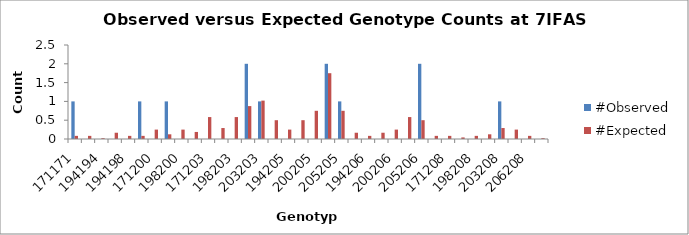
| Category | #Observed | #Expected |
|---|---|---|
| 171171.0 | 1 | 0.083 |
| 171194.0 | 0 | 0.083 |
| 194194.0 | 0 | 0.021 |
| 171198.0 | 0 | 0.167 |
| 194198.0 | 0 | 0.083 |
| 198198.0 | 1 | 0.083 |
| 171200.0 | 0 | 0.25 |
| 194200.0 | 1 | 0.125 |
| 198200.0 | 0 | 0.25 |
| 200200.0 | 0 | 0.188 |
| 171203.0 | 0 | 0.583 |
| 194203.0 | 0 | 0.292 |
| 198203.0 | 0 | 0.583 |
| 200203.0 | 2 | 0.875 |
| 203203.0 | 1 | 1.021 |
| 171205.0 | 0 | 0.5 |
| 194205.0 | 0 | 0.25 |
| 198205.0 | 0 | 0.5 |
| 200205.0 | 0 | 0.75 |
| 203205.0 | 2 | 1.75 |
| 205205.0 | 1 | 0.75 |
| 171206.0 | 0 | 0.167 |
| 194206.0 | 0 | 0.083 |
| 198206.0 | 0 | 0.167 |
| 200206.0 | 0 | 0.25 |
| 203206.0 | 0 | 0.583 |
| 205206.0 | 2 | 0.5 |
| 206206.0 | 0 | 0.083 |
| 171208.0 | 0 | 0.083 |
| 194208.0 | 0 | 0.042 |
| 198208.0 | 0 | 0.083 |
| 200208.0 | 0 | 0.125 |
| 203208.0 | 1 | 0.292 |
| 205208.0 | 0 | 0.25 |
| 206208.0 | 0 | 0.083 |
| 208208.0 | 0 | 0.021 |